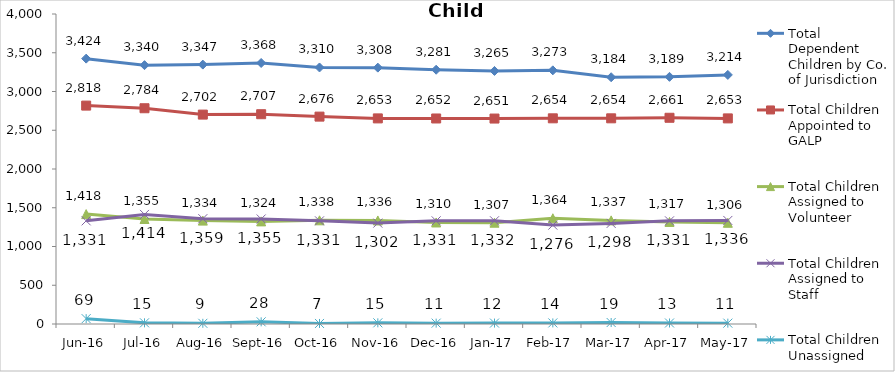
| Category | Total Dependent Children by Co. of Jurisdiction | Total Children Appointed to GALP | Total Children Assigned to Volunteer | Total Children Assigned to Staff | Total Children Unassigned |
|---|---|---|---|---|---|
| Jun-16 | 3424 | 2818 | 1418 | 1331 | 69 |
| Jul-16 | 3340 | 2784 | 1355 | 1414 | 15 |
| Aug-16 | 3347 | 2702 | 1334 | 1359 | 9 |
| Sep-16 | 3368 | 2707 | 1324 | 1355 | 28 |
| Oct-16 | 3310 | 2676 | 1338 | 1331 | 7 |
| Nov-16 | 3308 | 2653 | 1336 | 1302 | 15 |
| Dec-16 | 3281 | 2652 | 1310 | 1331 | 11 |
| Jan-17 | 3265 | 2651 | 1307 | 1332 | 12 |
| Feb-17 | 3273 | 2654 | 1364 | 1276 | 14 |
| Mar-17 | 3184 | 2654 | 1337 | 1298 | 19 |
| Apr-17 | 3189 | 2661 | 1317 | 1331 | 13 |
| May-17 | 3214 | 2653 | 1306 | 1336 | 11 |